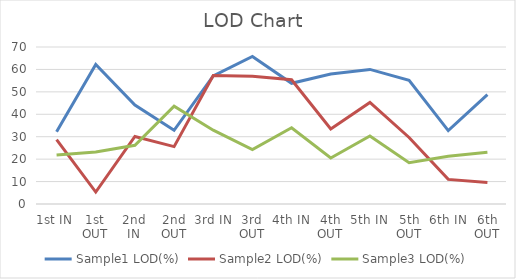
| Category | Sample1 LOD(%) | Sample2 LOD(%) | Sample3 LOD(%) |
|---|---|---|---|
| 1st IN | 32.22 | 28.7 | 21.8 |
| 1st OUT | 62.18 | 5.34 | 23.2 |
| 2nd IN | 44.1 | 30.12 | 26.2 |
| 2nd OUT | 32.86 | 25.58 | 43.6 |
| 3rd IN | 57.14 | 57.28 | 32.9 |
| 3rd OUT | 65.8 | 56.91 | 24.3 |
| 4th IN | 53.8 | 55.4 | 34 |
| 4th OUT | 57.92 | 33.49 | 20.5 |
| 5th IN | 60 | 45.3 | 30.3 |
| 5th OUT | 55.18 | 29.65 | 18.4 |
| 6th IN | 32.74 | 10.98 | 21.3 |
| 6th OUT | 48.8 | 9.63 | 23.1 |